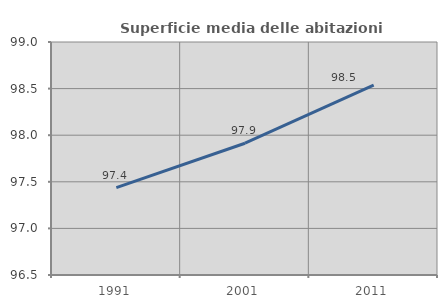
| Category | Superficie media delle abitazioni occupate |
|---|---|
| 1991.0 | 97.437 |
| 2001.0 | 97.914 |
| 2011.0 | 98.537 |